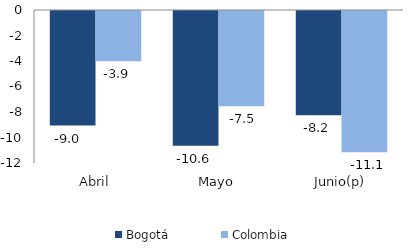
| Category | Bogotá | Colombia |
|---|---|---|
| Abril | -8.988 | -3.945 |
| Mayo | -10.559 | -7.477 |
| Junio(p) | -8.167 | -11.077 |